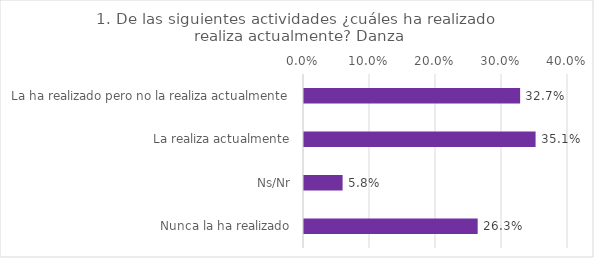
| Category | Series 0 |
|---|---|
| La ha realizado pero no la realiza actualmente | 0.327 |
| La realiza actualmente | 0.351 |
| Ns/Nr | 0.058 |
| Nunca la ha realizado | 0.263 |